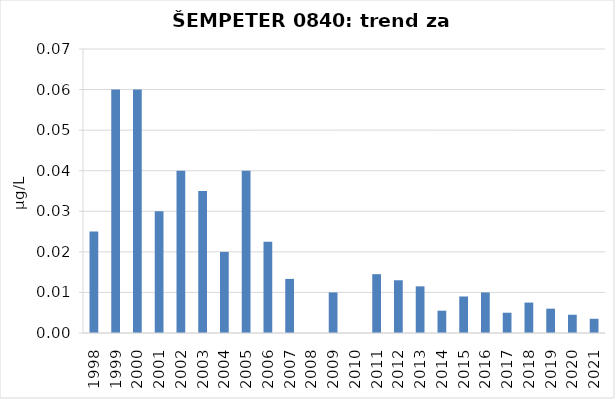
| Category | Vsota |
|---|---|
| 1998 | 0.025 |
| 1999 | 0.06 |
| 2000 | 0.06 |
| 2001 | 0.03 |
| 2002 | 0.04 |
| 2003 | 0.035 |
| 2004 | 0.02 |
| 2005 | 0.04 |
| 2006 | 0.022 |
| 2007 | 0.013 |
| 2008 | 0 |
| 2009 | 0.01 |
| 2010 | 0 |
| 2011 | 0.014 |
| 2012 | 0.013 |
| 2013 | 0.012 |
| 2014 | 0.006 |
| 2015 | 0.009 |
| 2016 | 0.01 |
| 2017 | 0.005 |
| 2018 | 0.008 |
| 2019 | 0.006 |
| 2020 | 0.005 |
| 2021 | 0.004 |